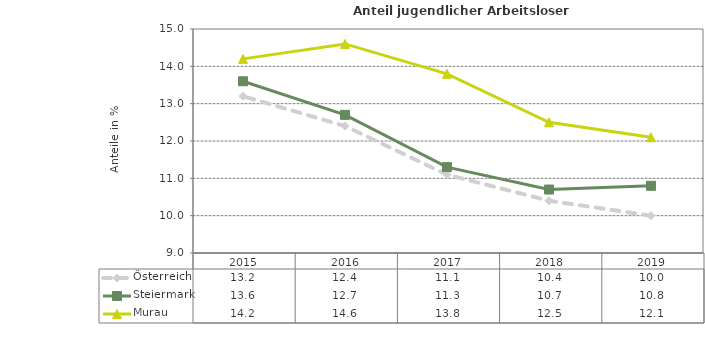
| Category | Österreich | Steiermark | Murau |
|---|---|---|---|
| 2019.0 | 10 | 10.8 | 12.1 |
| 2018.0 | 10.4 | 10.7 | 12.5 |
| 2017.0 | 11.1 | 11.3 | 13.8 |
| 2016.0 | 12.4 | 12.7 | 14.6 |
| 2015.0 | 13.2 | 13.6 | 14.2 |